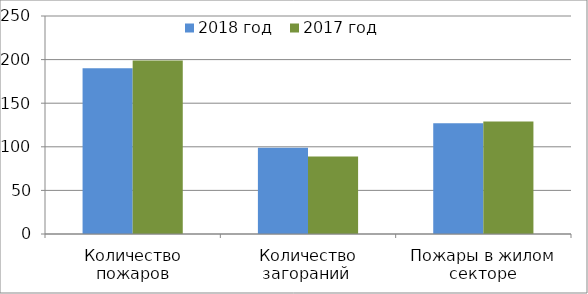
| Category | 2018 год | 2017 год |
|---|---|---|
| Количество пожаров | 190 | 199 |
| Количество загораний  | 99 | 89 |
| Пожары в жилом секторе | 127 | 129 |